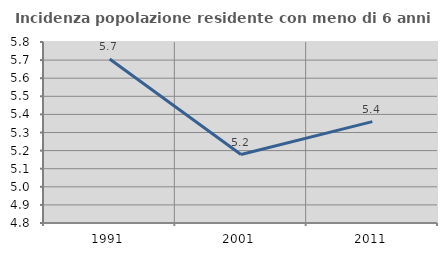
| Category | Incidenza popolazione residente con meno di 6 anni |
|---|---|
| 1991.0 | 5.706 |
| 2001.0 | 5.178 |
| 2011.0 | 5.36 |